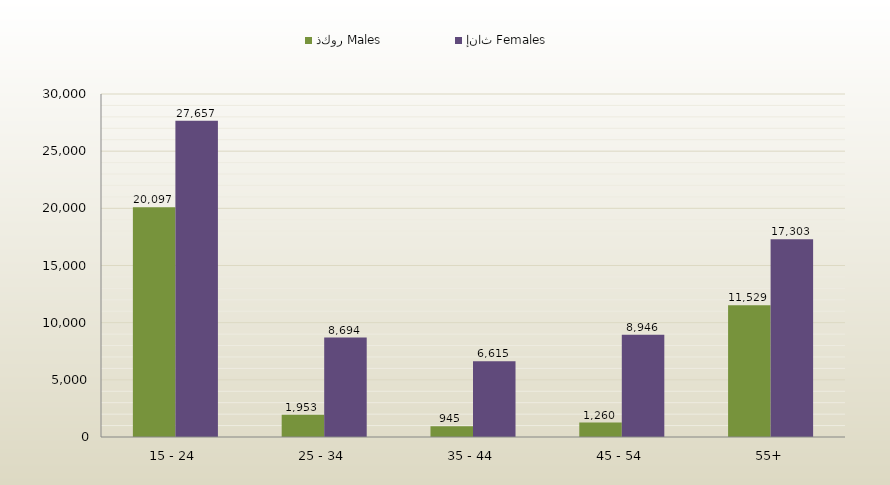
| Category | ذكور Males | إناث Females |
|---|---|---|
| 15 - 24 | 20097 | 27657 |
| 25 - 34 | 1953 | 8694 |
| 35 - 44 | 945 | 6615 |
| 45 - 54 | 1260 | 8946 |
| 55+ | 11529 | 17303 |